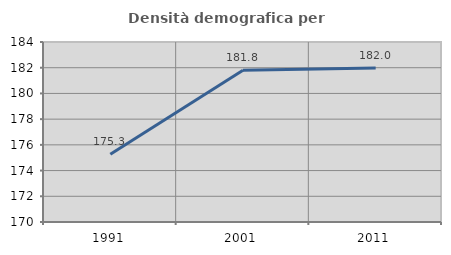
| Category | Densità demografica |
|---|---|
| 1991.0 | 175.271 |
| 2001.0 | 181.805 |
| 2011.0 | 181.969 |